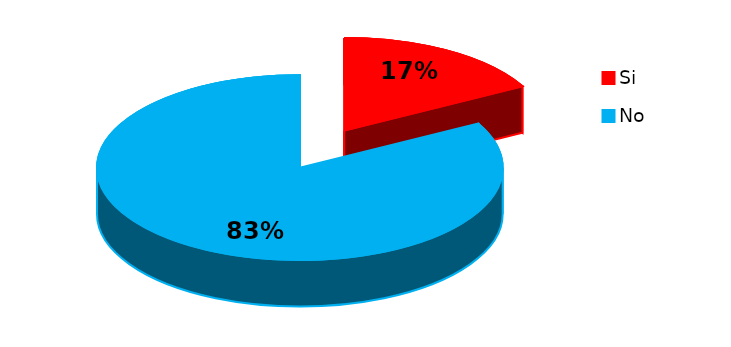
| Category | Series 0 |
|---|---|
| 0 | 27 |
| 1 | 131 |